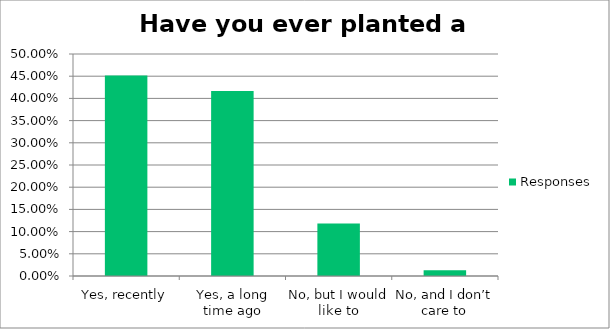
| Category | Responses |
|---|---|
| Yes, recently | 0.452 |
| Yes, a long time ago | 0.417 |
| No, but I would like to | 0.118 |
| No, and I don’t care to | 0.013 |